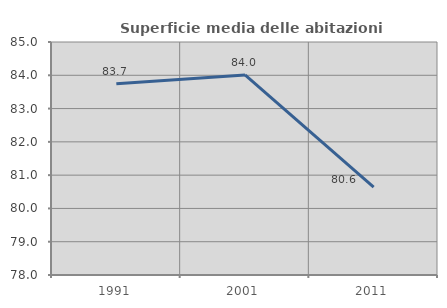
| Category | Superficie media delle abitazioni occupate |
|---|---|
| 1991.0 | 83.749 |
| 2001.0 | 84.01 |
| 2011.0 | 80.639 |